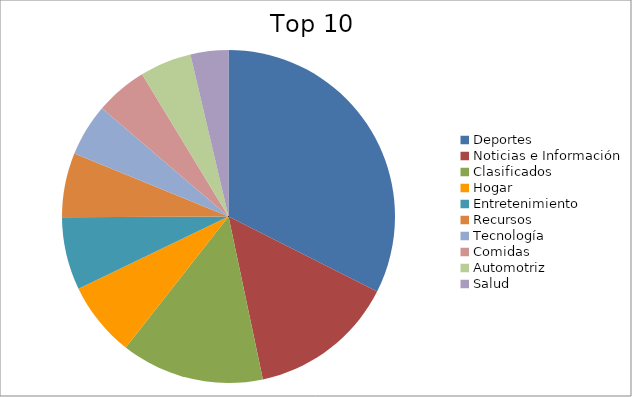
| Category | Series 0 |
|---|---|
| Deportes | 28.87 |
| Noticias e Información | 12.67 |
| Clasificados | 12.37 |
| Hogar | 6.47 |
| Entretenimiento | 6.29 |
| Recursos | 5.55 |
| Tecnología | 4.53 |
| Comidas | 4.5 |
| Automotriz | 4.46 |
| Salud | 3.27 |